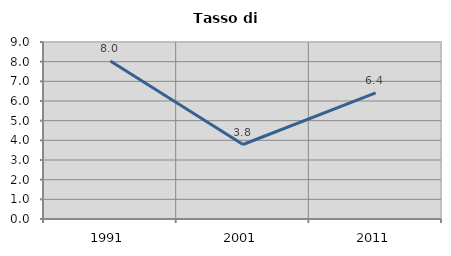
| Category | Tasso di disoccupazione   |
|---|---|
| 1991.0 | 8.036 |
| 2001.0 | 3.788 |
| 2011.0 | 6.41 |